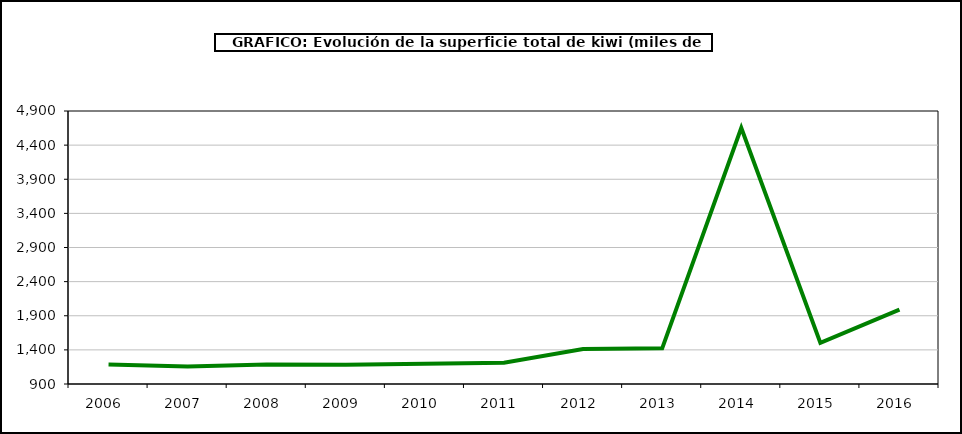
| Category | superficie kiwi |
|---|---|
| 2006.0 | 1186 |
| 2007.0 | 1158 |
| 2008.0 | 1187 |
| 2009.0 | 1183 |
| 2010.0 | 1196 |
| 2011.0 | 1213 |
| 2012.0 | 1413 |
| 2013.0 | 1423 |
| 2014.0 | 4653 |
| 2015.0 | 1502 |
| 2016.0 | 1989 |